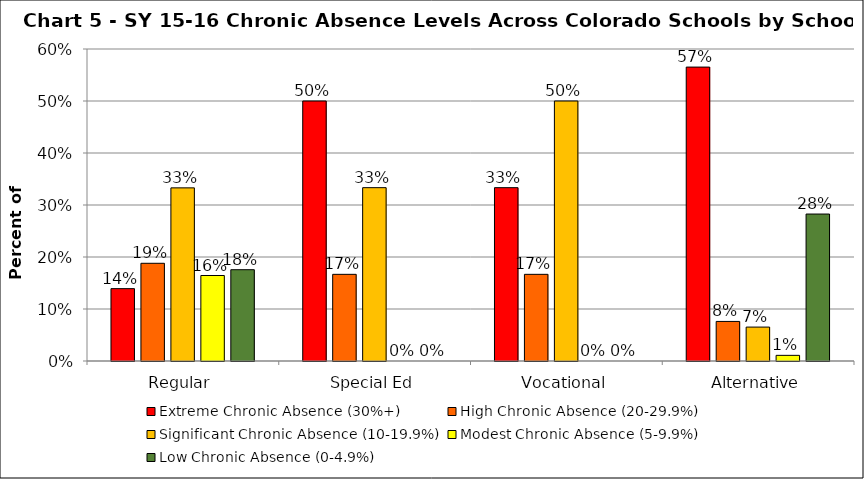
| Category | Extreme Chronic Absence (30%+) | High Chronic Absence (20-29.9%) | Significant Chronic Absence (10-19.9%) | Modest Chronic Absence (5-9.9%) | Low Chronic Absence (0-4.9%) |
|---|---|---|---|---|---|
| 0 | 0.139 | 0.188 | 0.333 | 0.164 | 0.176 |
| 1 | 0.5 | 0.167 | 0.333 | 0 | 0 |
| 2 | 0.333 | 0.167 | 0.5 | 0 | 0 |
| 3 | 0.565 | 0.076 | 0.065 | 0.011 | 0.283 |